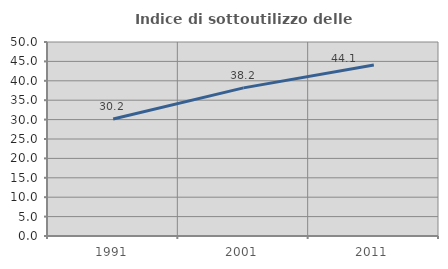
| Category | Indice di sottoutilizzo delle abitazioni  |
|---|---|
| 1991.0 | 30.16 |
| 2001.0 | 38.172 |
| 2011.0 | 44.059 |